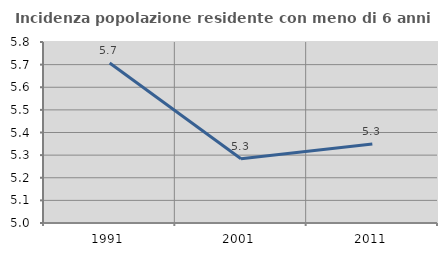
| Category | Incidenza popolazione residente con meno di 6 anni |
|---|---|
| 1991.0 | 5.707 |
| 2001.0 | 5.284 |
| 2011.0 | 5.35 |